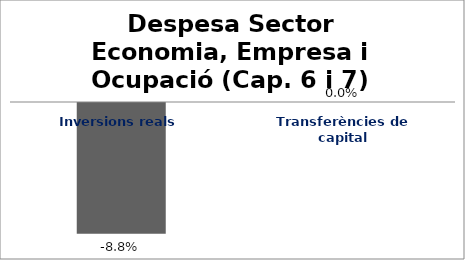
| Category | Series 0 |
|---|---|
| Inversions reals | -0.088 |
| Transferències de capital | 0 |